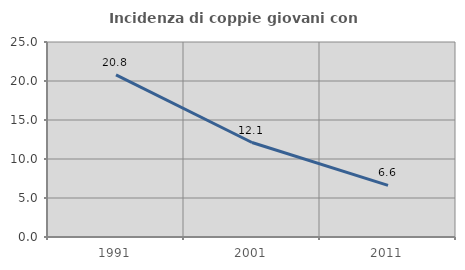
| Category | Incidenza di coppie giovani con figli |
|---|---|
| 1991.0 | 20.779 |
| 2001.0 | 12.113 |
| 2011.0 | 6.619 |